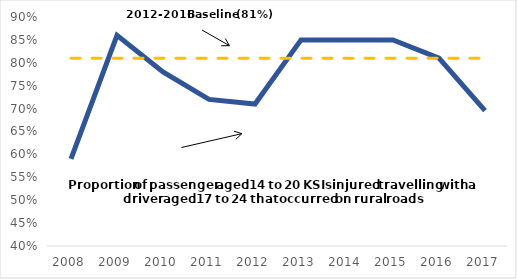
| Category | Series 0 | Series 2 |
|---|---|---|
| 2008.0 | 0.59 | 0.81 |
| 2009.0 | 0.86 | 0.81 |
| 2010.0 | 0.78 | 0.81 |
| 2011.0 | 0.72 | 0.81 |
| 2012.0 | 0.71 | 0.81 |
| 2013.0 | 0.85 | 0.81 |
| 2014.0 | 0.85 | 0.81 |
| 2015.0 | 0.85 | 0.81 |
| 2016.0 | 0.81 | 0.81 |
| 2017.0 | 0.696 | 0.81 |